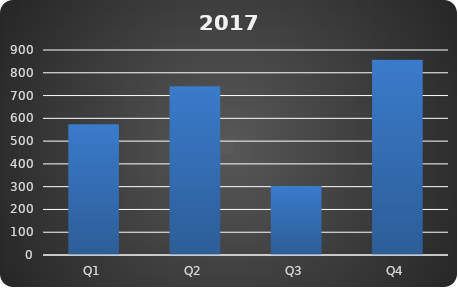
| Category | 2017 | Max |
|---|---|---|
| Q1 | 574 | 857 |
| Q2 | 741 | 857 |
| Q3 | 303 | 857 |
| Q4 | 857 | 857 |